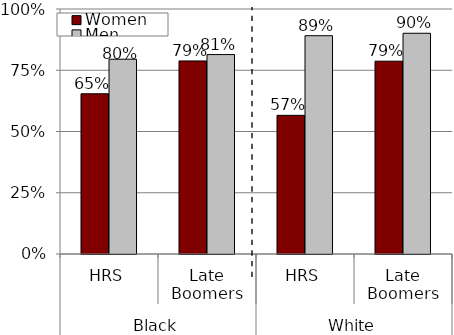
| Category | Women | Men |
|---|---|---|
| 0 | 0.654 | 0.795 |
| 1 | 0.788 | 0.814 |
| 2 | 0.566 | 0.891 |
| 3 | 0.787 | 0.901 |